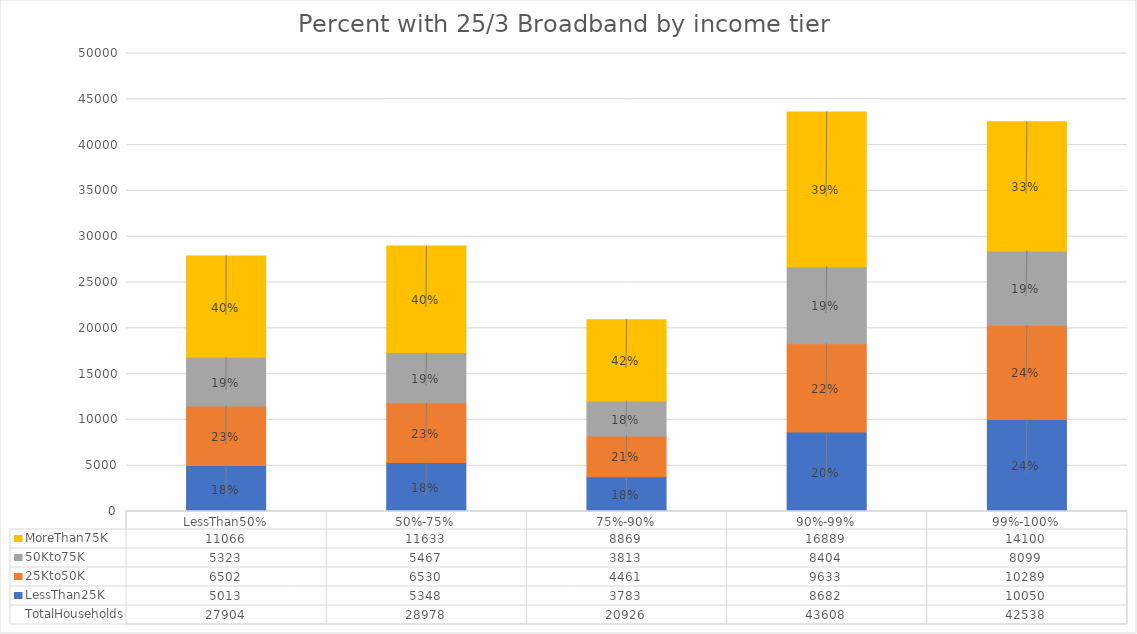
| Category | LessThan25K | 25Kto50K | 50Kto75K | MoreThan75K |
|---|---|---|---|---|
| LessThan50% | 5013 | 6502 | 5323 | 11066 |
| 50%-75% | 5348 | 6530 | 5467 | 11633 |
| 75%-90% | 3783 | 4461 | 3813 | 8869 |
| 90%-99% | 8682 | 9633 | 8404 | 16889 |
| 99%-100% | 10050 | 10289 | 8099 | 14100 |